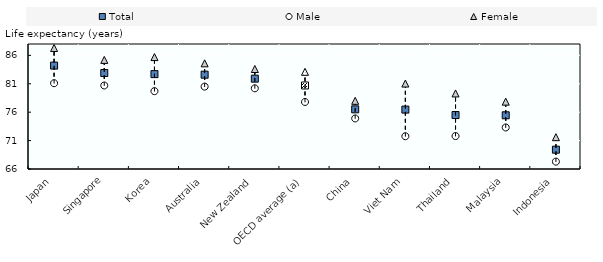
| Category | Total | Male | Female |
|---|---|---|---|
| Japan | 84.2 | 81.1 | 87.3 |
| Singapore | 82.895 | 80.7 | 85.2 |
| Korea | 82.7 | 79.7 | 85.7 |
| Australia | 82.6 | 80.5 | 84.6 |
| New Zealand | 81.9 | 80.2 | 83.6 |
| OECD average (a) | 80.7 | 77.8 | 83.1 |
| China | 76.5 | 74.9 | 78 |
| Viet Nam | 76.454 | 71.767 | 81.04 |
| Thailand | 75.498 | 71.798 | 79.298 |
| Malaysia | 75.452 | 73.309 | 77.853 |
| Indonesia | 69.4 | 67.3 | 71.6 |